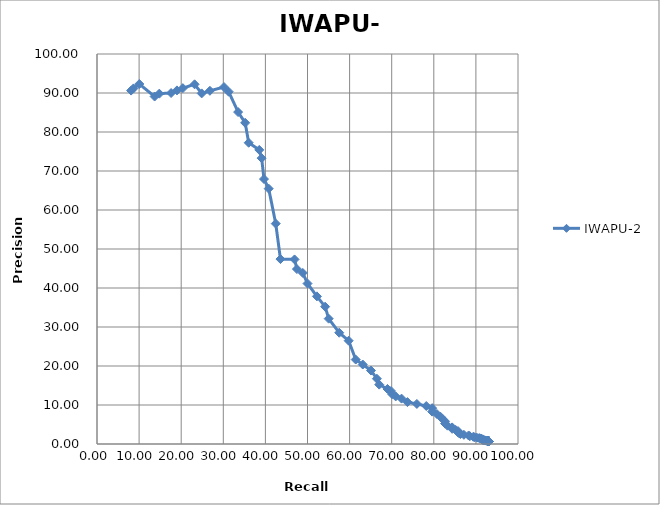
| Category | IWAPU-2 |
|---|---|
| 8.101 | 90.625 |
| 8.659 | 91.176 |
| 10.056 | 92.308 |
| 13.687 | 89.091 |
| 14.804 | 89.831 |
| 17.598 | 90 |
| 18.994 | 90.667 |
| 20.391 | 91.25 |
| 23.184 | 92.222 |
| 24.86 | 89.899 |
| 26.816 | 90.566 |
| 30.168 | 91.525 |
| 31.285 | 90.323 |
| 33.52 | 85.106 |
| 35.196 | 82.353 |
| 36.034 | 77.246 |
| 38.547 | 75.41 |
| 39.106 | 73.298 |
| 39.665 | 67.943 |
| 40.782 | 65.471 |
| 42.458 | 56.506 |
| 43.575 | 47.416 |
| 46.927 | 47.324 |
| 47.486 | 44.855 |
| 48.883 | 43.86 |
| 50.0 | 41.149 |
| 52.235 | 37.854 |
| 54.19 | 35.209 |
| 55.028 | 32.137 |
| 57.542 | 28.532 |
| 59.777 | 26.485 |
| 61.453 | 21.654 |
| 63.128 | 20.379 |
| 65.084 | 18.836 |
| 66.48 | 16.737 |
| 67.039 | 15.228 |
| 68.994 | 14.114 |
| 69.832 | 13.587 |
| 70.112 | 12.767 |
| 70.95 | 12.206 |
| 72.346 | 11.635 |
| 73.743 | 10.745 |
| 75.978 | 10.272 |
| 78.212 | 9.736 |
| 79.609 | 9.191 |
| 79.609 | 8.297 |
| 80.726 | 7.698 |
| 81.564 | 7.012 |
| 82.123 | 6.373 |
| 82.682 | 5.805 |
| 82.682 | 5.232 |
| 83.24 | 4.7 |
| 84.358 | 4.259 |
| 84.358 | 3.892 |
| 85.196 | 3.601 |
| 85.754 | 3.312 |
| 85.754 | 2.999 |
| 86.034 | 2.754 |
| 86.313 | 2.548 |
| 87.151 | 2.355 |
| 88.268 | 2.18 |
| 88.547 | 1.999 |
| 89.385 | 1.86 |
| 89.665 | 1.729 |
| 90.223 | 1.62 |
| 90.782 | 1.522 |
| 91.061 | 1.431 |
| 91.341 | 1.35 |
| 91.341 | 1.262 |
| 91.62 | 1.181 |
| 91.62 | 1.111 |
| 91.62 | 1.057 |
| 91.899 | 1.013 |
| 91.899 | 0.958 |
| 92.179 | 0.921 |
| 92.179 | 0.892 |
| 92.458 | 0.868 |
| 92.737 | 0.846 |
| 92.737 | 0.825 |
| 92.737 | 0.808 |
| 92.737 | 0.796 |
| 92.737 | 0.782 |
| 92.737 | 0.768 |
| 92.737 | 0.754 |
| 93.017 | 0.744 |
| 93.017 | 0.73 |
| 93.017 | 0.717 |
| 93.017 | 0.705 |
| 93.017 | 0.698 |
| 93.017 | 0.694 |
| 93.017 | 0.691 |
| 93.017 | 0.687 |
| 93.017 | 0.682 |
| 93.017 | 0.68 |
| 93.017 | 0.678 |
| 93.017 | 0.676 |
| 93.017 | 0.673 |
| 93.017 | 0.671 |
| 93.017 | 0.669 |
| 93.017 | 0.668 |